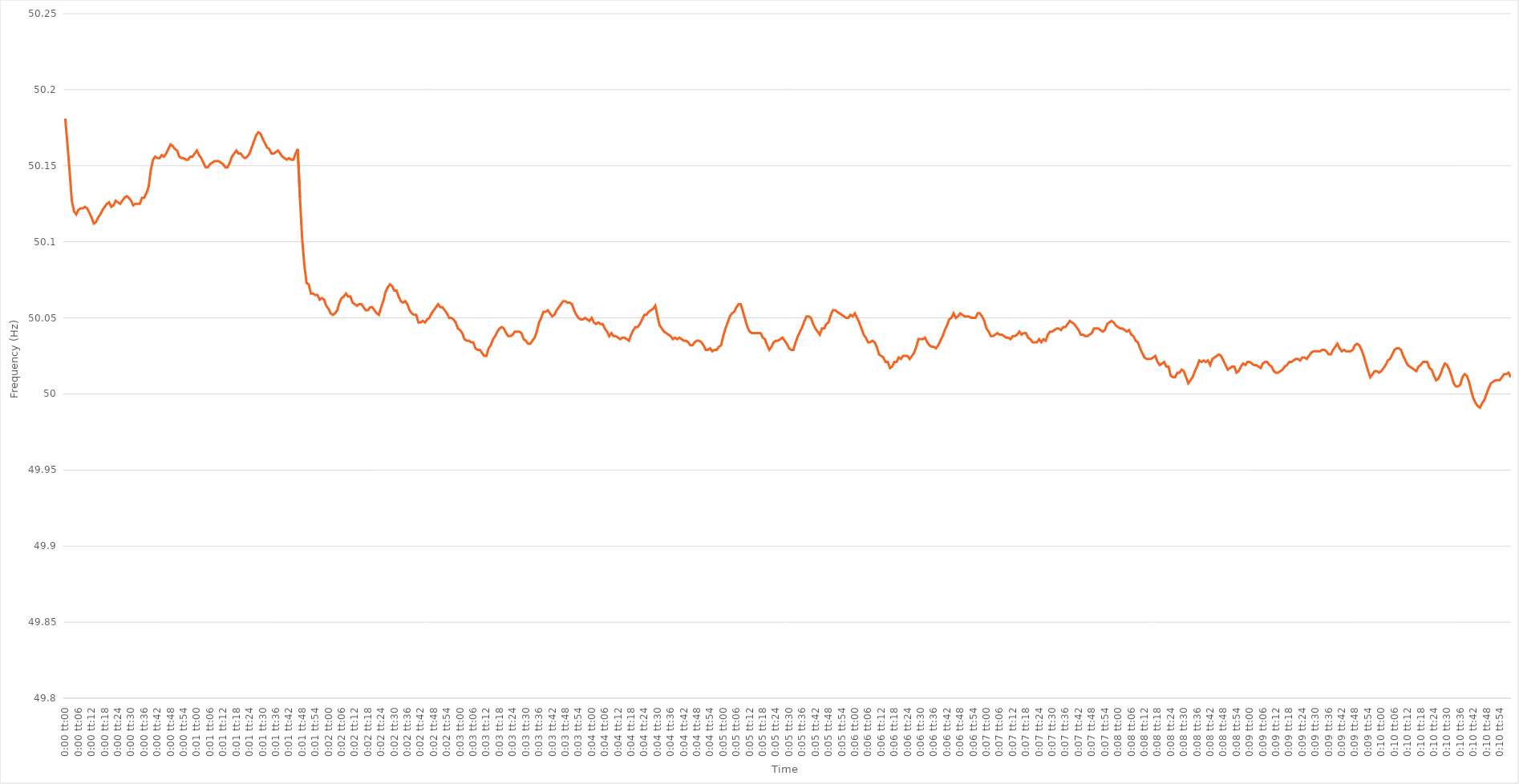
| Category | Series 0 |
|---|---|
| 0.0 | 50.181 |
| 1.1574074074074073e-05 | 50.164 |
| 2.3148148148148147e-05 | 50.146 |
| 3.472222222222222e-05 | 50.127 |
| 4.6296296296296294e-05 | 50.12 |
| 5.7870370370370366e-05 | 50.118 |
| 6.944444444444444e-05 | 50.121 |
| 8.101851851851852e-05 | 50.122 |
| 9.259259259259259e-05 | 50.122 |
| 0.00010416666666666667 | 50.123 |
| 0.00011574074074074073 | 50.122 |
| 0.0001273148148148148 | 50.119 |
| 0.0001388888888888889 | 50.116 |
| 0.00015046296296296297 | 50.112 |
| 0.00016203703703703703 | 50.113 |
| 0.00017361111111111112 | 50.116 |
| 0.00018518518518518518 | 50.118 |
| 0.00019675925925925926 | 50.121 |
| 0.00020833333333333335 | 50.123 |
| 0.0002199074074074074 | 50.125 |
| 0.00023148148148148146 | 50.126 |
| 0.00024305555555555552 | 50.123 |
| 0.0002546296296296296 | 50.124 |
| 0.0002662037037037037 | 50.127 |
| 0.0002777777777777778 | 50.126 |
| 0.0002893518518518519 | 50.125 |
| 0.00030092592592592595 | 50.127 |
| 0.0003125 | 50.129 |
| 0.00032407407407407406 | 50.13 |
| 0.0003356481481481481 | 50.129 |
| 0.00034722222222222224 | 50.127 |
| 0.00035879629629629635 | 50.124 |
| 0.00037037037037037035 | 50.125 |
| 0.00038194444444444446 | 50.125 |
| 0.0003935185185185185 | 50.125 |
| 0.0004050925925925926 | 50.129 |
| 0.0004166666666666667 | 50.129 |
| 0.00042824074074074075 | 50.132 |
| 0.0004398148148148148 | 50.136 |
| 0.0004513888888888889 | 50.147 |
| 0.0004629629629629629 | 50.154 |
| 0.00047453703703703704 | 50.156 |
| 0.00048611111111111104 | 50.155 |
| 0.0004976851851851852 | 50.155 |
| 0.0005092592592592592 | 50.157 |
| 0.0005208333333333333 | 50.156 |
| 0.0005324074074074074 | 50.158 |
| 0.0005439814814814814 | 50.161 |
| 0.0005555555555555556 | 50.164 |
| 0.0005671296296296296 | 50.163 |
| 0.0005787037037037038 | 50.161 |
| 0.0005902777777777778 | 50.16 |
| 0.0006018518518518519 | 50.156 |
| 0.0006134259259259259 | 50.155 |
| 0.000625 | 50.155 |
| 0.000636574074074074 | 50.154 |
| 0.0006481481481481481 | 50.154 |
| 0.0006597222222222221 | 50.156 |
| 0.0006712962962962962 | 50.156 |
| 0.0006828703703703703 | 50.158 |
| 0.0006944444444444445 | 50.16 |
| 0.0007060185185185185 | 50.157 |
| 0.0007175925925925927 | 50.155 |
| 0.0007291666666666667 | 50.152 |
| 0.0007407407407407407 | 50.149 |
| 0.0007523148148148147 | 50.149 |
| 0.0007638888888888889 | 50.151 |
| 0.000775462962962963 | 50.152 |
| 0.000787037037037037 | 50.153 |
| 0.000798611111111111 | 50.153 |
| 0.0008101851851851852 | 50.153 |
| 0.0008217592592592592 | 50.152 |
| 0.0008333333333333334 | 50.151 |
| 0.0008449074074074075 | 50.149 |
| 0.0008564814814814815 | 50.149 |
| 0.0008680555555555555 | 50.152 |
| 0.0008796296296296296 | 50.156 |
| 0.0008912037037037036 | 50.158 |
| 0.0009027777777777778 | 50.16 |
| 0.0009143518518518518 | 50.158 |
| 0.0009259259259259259 | 50.158 |
| 0.0009375000000000001 | 50.156 |
| 0.0009490740740740741 | 50.155 |
| 0.0009606481481481481 | 50.156 |
| 0.0009722222222222221 | 50.158 |
| 0.0009837962962962964 | 50.162 |
| 0.0009953703703703704 | 50.166 |
| 0.0010069444444444444 | 50.17 |
| 0.0010185185185185186 | 50.172 |
| 0.0010300925925925926 | 50.171 |
| 0.0010416666666666667 | 50.168 |
| 0.0010532407407407407 | 50.165 |
| 0.0010648148148148147 | 50.162 |
| 0.0010763888888888889 | 50.161 |
| 0.0010879629629629629 | 50.158 |
| 0.001099537037037037 | 50.158 |
| 0.0011111111111111111 | 50.159 |
| 0.0011226851851851851 | 50.16 |
| 0.0011342592592592591 | 50.158 |
| 0.0011458333333333333 | 50.156 |
| 0.0011574074074074073 | 50.155 |
| 0.0011689814814814816 | 50.154 |
| 0.0011805555555555556 | 50.155 |
| 0.0011921296296296296 | 50.154 |
| 0.0012037037037037038 | 50.154 |
| 0.0012152777777777778 | 50.158 |
| 0.0012268518518518518 | 50.161 |
| 0.0012384259259259258 | 50.129 |
| 0.00125 | 50.102 |
| 0.001261574074074074 | 50.085 |
| 0.0012731481481481483 | 50.073 |
| 0.0012847222222222223 | 50.072 |
| 0.0012962962962962963 | 50.066 |
| 0.0013078703703703705 | 50.066 |
| 0.0013194444444444443 | 50.065 |
| 0.0013310185185185185 | 50.065 |
| 0.0013425925925925925 | 50.062 |
| 0.0013541666666666667 | 50.063 |
| 0.001365740740740741 | 50.062 |
| 0.0013773148148148147 | 50.058 |
| 0.001388888888888889 | 50.056 |
| 0.001400462962962963 | 50.053 |
| 0.001412037037037037 | 50.052 |
| 0.001423611111111111 | 50.053 |
| 0.0014351851851851854 | 50.055 |
| 0.0014467592592592594 | 50.06 |
| 0.0014583333333333334 | 50.063 |
| 0.0014699074074074074 | 50.064 |
| 0.0014814814814814814 | 50.066 |
| 0.0014930555555555556 | 50.064 |
| 0.0015046296296296294 | 50.064 |
| 0.0015162037037037036 | 50.06 |
| 0.0015277777777777779 | 50.059 |
| 0.0015393518518518519 | 50.058 |
| 0.001550925925925926 | 50.059 |
| 0.0015624999999999999 | 50.059 |
| 0.001574074074074074 | 50.057 |
| 0.0015856481481481479 | 50.055 |
| 0.001597222222222222 | 50.055 |
| 0.0016087962962962963 | 50.057 |
| 0.0016203703703703703 | 50.057 |
| 0.0016319444444444445 | 50.055 |
| 0.0016435185185185183 | 50.053 |
| 0.0016550925925925926 | 50.052 |
| 0.0016666666666666668 | 50.057 |
| 0.0016782407407407406 | 50.061 |
| 0.001689814814814815 | 50.067 |
| 0.0017013888888888892 | 50.07 |
| 0.001712962962962963 | 50.072 |
| 0.0017245370370370372 | 50.071 |
| 0.001736111111111111 | 50.068 |
| 0.0017476851851851852 | 50.068 |
| 0.0017592592592592592 | 50.064 |
| 0.0017708333333333332 | 50.061 |
| 0.0017824074074074072 | 50.06 |
| 0.0017939814814814815 | 50.061 |
| 0.0018055555555555557 | 50.059 |
| 0.0018171296296296297 | 50.055 |
| 0.0018287037037037037 | 50.053 |
| 0.0018402777777777777 | 50.052 |
| 0.0018518518518518517 | 50.052 |
| 0.0018634259259259261 | 50.047 |
| 0.0018750000000000001 | 50.047 |
| 0.0018865740740740742 | 50.048 |
| 0.0018981481481481482 | 50.047 |
| 0.0019097222222222222 | 50.049 |
| 0.0019212962962962962 | 50.05 |
| 0.0019328703703703704 | 50.053 |
| 0.0019444444444444442 | 50.055 |
| 0.0019560185185185184 | 50.057 |
| 0.001967592592592593 | 50.059 |
| 0.001979166666666667 | 50.057 |
| 0.001990740740740741 | 50.057 |
| 0.002002314814814815 | 50.055 |
| 0.002013888888888889 | 50.053 |
| 0.002025462962962963 | 50.05 |
| 0.0020370370370370373 | 50.05 |
| 0.0020486111111111113 | 50.049 |
| 0.0020601851851851853 | 50.047 |
| 0.0020717592592592593 | 50.043 |
| 0.0020833333333333333 | 50.042 |
| 0.0020949074074074073 | 50.04 |
| 0.0021064814814814813 | 50.036 |
| 0.0021180555555555553 | 50.035 |
| 0.0021296296296296298 | 50.035 |
| 0.0021412037037037038 | 50.034 |
| 0.0021527777777777778 | 50.034 |
| 0.0021643518518518518 | 50.03 |
| 0.0021759259259259258 | 50.029 |
| 0.0021874999999999998 | 50.029 |
| 0.002199074074074074 | 50.027 |
| 0.0022106481481481478 | 50.025 |
| 0.0022222222222222222 | 50.025 |
| 0.0022337962962962967 | 50.03 |
| 0.0022453703703703702 | 50.032 |
| 0.0022569444444444447 | 50.036 |
| 0.0022685185185185182 | 50.038 |
| 0.0022800925925925927 | 50.041 |
| 0.0022916666666666667 | 50.043 |
| 0.0023032407407407407 | 50.044 |
| 0.002314814814814815 | 50.043 |
| 0.0023263888888888887 | 50.04 |
| 0.002337962962962963 | 50.038 |
| 0.002349537037037037 | 50.038 |
| 0.002361111111111111 | 50.039 |
| 0.002372685185185185 | 50.041 |
| 0.002384259259259259 | 50.041 |
| 0.0023958333333333336 | 50.041 |
| 0.0024074074074074076 | 50.04 |
| 0.0024189814814814816 | 50.036 |
| 0.0024305555555555556 | 50.035 |
| 0.0024421296296296296 | 50.033 |
| 0.0024537037037037036 | 50.033 |
| 0.0024652777777777776 | 50.035 |
| 0.0024768518518518516 | 50.037 |
| 0.002488425925925926 | 50.041 |
| 0.0025 | 50.047 |
| 0.002511574074074074 | 50.05 |
| 0.002523148148148148 | 50.054 |
| 0.002534722222222222 | 50.054 |
| 0.002546296296296296 | 50.055 |
| 0.0025578703703703705 | 50.053 |
| 0.0025694444444444445 | 50.051 |
| 0.0025810185185185185 | 50.052 |
| 0.0025925925925925925 | 50.055 |
| 0.0026041666666666665 | 50.057 |
| 0.002615740740740741 | 50.059 |
| 0.002627314814814815 | 50.061 |
| 0.0026388888888888885 | 50.061 |
| 0.0026504629629629625 | 50.06 |
| 0.0026620370370370374 | 50.06 |
| 0.002673611111111111 | 50.059 |
| 0.002685185185185185 | 50.055 |
| 0.0026967592592592594 | 50.052 |
| 0.0027083333333333334 | 50.05 |
| 0.0027199074074074074 | 50.049 |
| 0.002731481481481482 | 50.049 |
| 0.002743055555555556 | 50.05 |
| 0.0027546296296296294 | 50.049 |
| 0.0027662037037037034 | 50.048 |
| 0.002777777777777778 | 50.05 |
| 0.002789351851851852 | 50.047 |
| 0.002800925925925926 | 50.046 |
| 0.0028124999999999995 | 50.047 |
| 0.002824074074074074 | 50.046 |
| 0.002835648148148148 | 50.046 |
| 0.002847222222222222 | 50.043 |
| 0.0028587962962962963 | 50.041 |
| 0.002870370370370371 | 50.038 |
| 0.0028819444444444444 | 50.04 |
| 0.002893518518518519 | 50.038 |
| 0.002905092592592593 | 50.038 |
| 0.002916666666666667 | 50.037 |
| 0.0029282407407407412 | 50.036 |
| 0.002939814814814815 | 50.037 |
| 0.002951388888888889 | 50.037 |
| 0.002962962962962963 | 50.036 |
| 0.0029745370370370373 | 50.035 |
| 0.0029861111111111113 | 50.039 |
| 0.002997685185185185 | 50.042 |
| 0.003009259259259259 | 50.044 |
| 0.0030208333333333333 | 50.044 |
| 0.0030324074074074073 | 50.046 |
| 0.003043981481481482 | 50.049 |
| 0.0030555555555555557 | 50.052 |
| 0.0030671296296296297 | 50.052 |
| 0.0030787037037037037 | 50.054 |
| 0.003090277777777778 | 50.055 |
| 0.003101851851851852 | 50.056 |
| 0.0031134259259259257 | 50.058 |
| 0.0031249999999999997 | 50.051 |
| 0.003136574074074074 | 50.045 |
| 0.003148148148148148 | 50.043 |
| 0.003159722222222222 | 50.041 |
| 0.0031712962962962958 | 50.04 |
| 0.00318287037037037 | 50.039 |
| 0.003194444444444444 | 50.038 |
| 0.003206018518518519 | 50.036 |
| 0.0032175925925925926 | 50.037 |
| 0.0032291666666666666 | 50.036 |
| 0.0032407407407407406 | 50.037 |
| 0.003252314814814815 | 50.036 |
| 0.003263888888888889 | 50.035 |
| 0.003275462962962963 | 50.035 |
| 0.0032870370370370367 | 50.034 |
| 0.003298611111111111 | 50.032 |
| 0.003310185185185185 | 50.032 |
| 0.003321759259259259 | 50.034 |
| 0.0033333333333333335 | 50.035 |
| 0.003344907407407407 | 50.035 |
| 0.003356481481481481 | 50.034 |
| 0.003368055555555555 | 50.032 |
| 0.00337962962962963 | 50.029 |
| 0.0033912037037037036 | 50.029 |
| 0.0034027777777777784 | 50.03 |
| 0.003414351851851852 | 50.028 |
| 0.003425925925925926 | 50.029 |
| 0.0034375 | 50.029 |
| 0.0034490740740740745 | 50.031 |
| 0.0034606481481481485 | 50.032 |
| 0.003472222222222222 | 50.038 |
| 0.003483796296296296 | 50.043 |
| 0.0034953703703703705 | 50.047 |
| 0.0035069444444444445 | 50.051 |
| 0.0035185185185185185 | 50.053 |
| 0.003530092592592592 | 50.054 |
| 0.0035416666666666665 | 50.057 |
| 0.0035532407407407405 | 50.059 |
| 0.0035648148148148154 | 50.059 |
| 0.0035763888888888894 | 50.054 |
| 0.003587962962962963 | 50.049 |
| 0.003599537037037037 | 50.044 |
| 0.0036111111111111114 | 50.041 |
| 0.0036226851851851854 | 50.04 |
| 0.0036342592592592594 | 50.04 |
| 0.003645833333333333 | 50.04 |
| 0.0036574074074074074 | 50.04 |
| 0.0036689814814814814 | 50.04 |
| 0.0036805555555555554 | 50.037 |
| 0.00369212962962963 | 50.036 |
| 0.0037037037037037034 | 50.032 |
| 0.0037152777777777774 | 50.029 |
| 0.0037268518518518514 | 50.031 |
| 0.0037384259259259263 | 50.034 |
| 0.0037500000000000003 | 50.035 |
| 0.003761574074074074 | 50.035 |
| 0.0037731481481481483 | 50.036 |
| 0.0037847222222222223 | 50.037 |
| 0.0037962962962962963 | 50.035 |
| 0.0038078703703703707 | 50.033 |
| 0.0038194444444444443 | 50.03 |
| 0.0038310185185185183 | 50.029 |
| 0.0038425925925925923 | 50.029 |
| 0.0038541666666666668 | 50.034 |
| 0.0038657407407407408 | 50.038 |
| 0.0038773148148148143 | 50.041 |
| 0.0038888888888888883 | 50.044 |
| 0.003900462962962963 | 50.048 |
| 0.003912037037037037 | 50.051 |
| 0.003923611111111111 | 50.051 |
| 0.003935185185185186 | 50.05 |
| 0.003946759259259259 | 50.046 |
| 0.003958333333333334 | 50.043 |
| 0.003969907407407407 | 50.041 |
| 0.003981481481481482 | 50.039 |
| 0.003993055555555556 | 50.043 |
| 0.00400462962962963 | 50.043 |
| 0.004016203703703703 | 50.046 |
| 0.004027777777777778 | 50.047 |
| 0.004039351851851852 | 50.052 |
| 0.004050925925925926 | 50.055 |
| 0.004062499999999999 | 50.055 |
| 0.004074074074074075 | 50.054 |
| 0.004085648148148148 | 50.053 |
| 0.004097222222222223 | 50.052 |
| 0.004108796296296297 | 50.051 |
| 0.004120370370370371 | 50.05 |
| 0.004131944444444444 | 50.05 |
| 0.004143518518518519 | 50.052 |
| 0.004155092592592593 | 50.051 |
| 0.004166666666666667 | 50.053 |
| 0.00417824074074074 | 50.05 |
| 0.004189814814814815 | 50.047 |
| 0.004201388888888889 | 50.043 |
| 0.004212962962962963 | 50.039 |
| 0.004224537037037037 | 50.037 |
| 0.004236111111111111 | 50.034 |
| 0.004247685185185185 | 50.034 |
| 0.0042592592592592595 | 50.035 |
| 0.004270833333333334 | 50.034 |
| 0.0042824074074074075 | 50.031 |
| 0.004293981481481481 | 50.026 |
| 0.0043055555555555555 | 50.025 |
| 0.00431712962962963 | 50.024 |
| 0.0043287037037037035 | 50.021 |
| 0.004340277777777778 | 50.021 |
| 0.0043518518518518515 | 50.017 |
| 0.004363425925925926 | 50.018 |
| 0.0043749999999999995 | 50.021 |
| 0.004386574074074074 | 50.021 |
| 0.004398148148148148 | 50.024 |
| 0.004409722222222222 | 50.023 |
| 0.0044212962962962956 | 50.025 |
| 0.004432870370370371 | 50.025 |
| 0.0044444444444444444 | 50.025 |
| 0.004456018518518519 | 50.023 |
| 0.004467592592592593 | 50.025 |
| 0.004479166666666667 | 50.027 |
| 0.0044907407407407405 | 50.031 |
| 0.004502314814814815 | 50.036 |
| 0.004513888888888889 | 50.036 |
| 0.004525462962962963 | 50.036 |
| 0.0045370370370370365 | 50.037 |
| 0.004548611111111111 | 50.034 |
| 0.004560185185185185 | 50.032 |
| 0.004571759259259259 | 50.031 |
| 0.004583333333333333 | 50.031 |
| 0.004594907407407408 | 50.03 |
| 0.004606481481481481 | 50.032 |
| 0.004618055555555556 | 50.035 |
| 0.00462962962962963 | 50.038 |
| 0.004641203703703704 | 50.042 |
| 0.004652777777777777 | 50.045 |
| 0.004664351851851852 | 50.049 |
| 0.004675925925925926 | 50.05 |
| 0.0046875 | 50.053 |
| 0.004699074074074074 | 50.05 |
| 0.004710648148148148 | 50.051 |
| 0.004722222222222222 | 50.053 |
| 0.004733796296296296 | 50.052 |
| 0.00474537037037037 | 50.051 |
| 0.004756944444444445 | 50.051 |
| 0.004768518518518518 | 50.051 |
| 0.004780092592592592 | 50.05 |
| 0.004791666666666667 | 50.05 |
| 0.004803240740740741 | 50.05 |
| 0.004814814814814815 | 50.053 |
| 0.004826388888888889 | 50.053 |
| 0.004837962962962963 | 50.051 |
| 0.004849537037037037 | 50.048 |
| 0.004861111111111111 | 50.043 |
| 0.004872685185185186 | 50.041 |
| 0.004884259259259259 | 50.038 |
| 0.004895833333333333 | 50.038 |
| 0.004907407407407407 | 50.039 |
| 0.004918981481481482 | 50.04 |
| 0.004930555555555555 | 50.039 |
| 0.004942129629629629 | 50.039 |
| 0.004953703703703704 | 50.038 |
| 0.004965277777777778 | 50.037 |
| 0.004976851851851852 | 50.037 |
| 0.0049884259259259265 | 50.036 |
| 0.005 | 50.038 |
| 0.005011574074074074 | 50.038 |
| 0.005023148148148148 | 50.039 |
| 0.0050347222222222225 | 50.041 |
| 0.005046296296296296 | 50.039 |
| 0.0050578703703703706 | 50.04 |
| 0.005069444444444444 | 50.04 |
| 0.0050810185185185186 | 50.037 |
| 0.005092592592592592 | 50.036 |
| 0.005104166666666667 | 50.034 |
| 0.005115740740740741 | 50.034 |
| 0.005127314814814815 | 50.034 |
| 0.005138888888888889 | 50.036 |
| 0.0051504629629629635 | 50.034 |
| 0.005162037037037037 | 50.036 |
| 0.0051736111111111115 | 50.035 |
| 0.005185185185185185 | 50.039 |
| 0.0051967592592592595 | 50.041 |
| 0.005208333333333333 | 50.041 |
| 0.005219907407407407 | 50.042 |
| 0.005231481481481482 | 50.043 |
| 0.0052430555555555555 | 50.043 |
| 0.00525462962962963 | 50.042 |
| 0.0052662037037037035 | 50.044 |
| 0.005277777777777777 | 50.044 |
| 0.0052893518518518515 | 50.046 |
| 0.005300925925925925 | 50.048 |
| 0.0053125 | 50.047 |
| 0.005324074074074075 | 50.046 |
| 0.005335648148148148 | 50.044 |
| 0.005347222222222222 | 50.042 |
| 0.005358796296296296 | 50.039 |
| 0.00537037037037037 | 50.039 |
| 0.005381944444444445 | 50.038 |
| 0.005393518518518519 | 50.038 |
| 0.005405092592592592 | 50.039 |
| 0.005416666666666667 | 50.04 |
| 0.00542824074074074 | 50.043 |
| 0.005439814814814815 | 50.043 |
| 0.005451388888888888 | 50.043 |
| 0.005462962962962964 | 50.042 |
| 0.005474537037037037 | 50.041 |
| 0.005486111111111112 | 50.042 |
| 0.005497685185185185 | 50.046 |
| 0.005509259259259259 | 50.047 |
| 0.005520833333333333 | 50.048 |
| 0.005532407407407407 | 50.047 |
| 0.005543981481481482 | 50.045 |
| 0.005555555555555556 | 50.044 |
| 0.00556712962962963 | 50.043 |
| 0.005578703703703704 | 50.043 |
| 0.005590277777777778 | 50.042 |
| 0.005601851851851852 | 50.041 |
| 0.005613425925925927 | 50.042 |
| 0.005624999999999999 | 50.039 |
| 0.005636574074074074 | 50.038 |
| 0.005648148148148148 | 50.035 |
| 0.005659722222222222 | 50.034 |
| 0.005671296296296296 | 50.03 |
| 0.00568287037037037 | 50.027 |
| 0.005694444444444444 | 50.024 |
| 0.005706018518518519 | 50.023 |
| 0.005717592592592593 | 50.023 |
| 0.005729166666666667 | 50.023 |
| 0.005740740740740742 | 50.024 |
| 0.005752314814814814 | 50.025 |
| 0.005763888888888889 | 50.021 |
| 0.005775462962962962 | 50.019 |
| 0.005787037037037038 | 50.02 |
| 0.005798611111111111 | 50.021 |
| 0.005810185185185186 | 50.018 |
| 0.005821759259259259 | 50.018 |
| 0.005833333333333334 | 50.012 |
| 0.005844907407407407 | 50.011 |
| 0.0058564814814814825 | 50.011 |
| 0.005868055555555554 | 50.014 |
| 0.00587962962962963 | 50.014 |
| 0.005891203703703703 | 50.016 |
| 0.005902777777777778 | 50.015 |
| 0.005914351851851852 | 50.011 |
| 0.005925925925925926 | 50.007 |
| 0.005937500000000001 | 50.009 |
| 0.0059490740740740745 | 50.011 |
| 0.005960648148148149 | 50.015 |
| 0.0059722222222222225 | 50.018 |
| 0.005983796296296296 | 50.022 |
| 0.00599537037037037 | 50.021 |
| 0.006006944444444444 | 50.022 |
| 0.006018518518518518 | 50.021 |
| 0.006030092592592593 | 50.022 |
| 0.0060416666666666665 | 50.019 |
| 0.006053240740740741 | 50.023 |
| 0.0060648148148148145 | 50.024 |
| 0.006076388888888889 | 50.025 |
| 0.006087962962962964 | 50.026 |
| 0.006099537037037036 | 50.025 |
| 0.006111111111111111 | 50.022 |
| 0.006122685185185185 | 50.019 |
| 0.0061342592592592594 | 50.016 |
| 0.006145833333333333 | 50.017 |
| 0.0061574074074074074 | 50.018 |
| 0.006168981481481481 | 50.018 |
| 0.006180555555555556 | 50.014 |
| 0.00619212962962963 | 50.015 |
| 0.006203703703703704 | 50.018 |
| 0.006215277777777777 | 50.02 |
| 0.0062268518518518515 | 50.019 |
| 0.006238425925925925 | 50.021 |
| 0.0062499999999999995 | 50.021 |
| 0.006261574074074075 | 50.02 |
| 0.006273148148148148 | 50.019 |
| 0.006284722222222223 | 50.019 |
| 0.006296296296296296 | 50.018 |
| 0.006307870370370371 | 50.017 |
| 0.006319444444444444 | 50.02 |
| 0.00633101851851852 | 50.021 |
| 0.0063425925925925915 | 50.021 |
| 0.006354166666666667 | 50.019 |
| 0.00636574074074074 | 50.018 |
| 0.006377314814814815 | 50.015 |
| 0.006388888888888888 | 50.014 |
| 0.006400462962962963 | 50.014 |
| 0.006412037037037036 | 50.015 |
| 0.006423611111111112 | 50.016 |
| 0.006435185185185186 | 50.018 |
| 0.00644675925925926 | 50.019 |
| 0.006458333333333333 | 50.021 |
| 0.006469907407407407 | 50.021 |
| 0.006481481481481481 | 50.022 |
| 0.006493055555555555 | 50.023 |
| 0.00650462962962963 | 50.023 |
| 0.006516203703703704 | 50.022 |
| 0.006527777777777778 | 50.024 |
| 0.006539351851851852 | 50.024 |
| 0.006550925925925926 | 50.023 |
| 0.0065625 | 50.025 |
| 0.006574074074074073 | 50.027 |
| 0.006585648148148147 | 50.028 |
| 0.006597222222222222 | 50.028 |
| 0.006608796296296297 | 50.028 |
| 0.00662037037037037 | 50.028 |
| 0.006631944444444445 | 50.029 |
| 0.006643518518518518 | 50.029 |
| 0.0066550925925925935 | 50.028 |
| 0.006666666666666667 | 50.026 |
| 0.0066782407407407415 | 50.026 |
| 0.006689814814814814 | 50.029 |
| 0.006701388888888889 | 50.031 |
| 0.006712962962962962 | 50.033 |
| 0.006724537037037037 | 50.03 |
| 0.00673611111111111 | 50.028 |
| 0.0067476851851851856 | 50.029 |
| 0.006759259259259259 | 50.028 |
| 0.0067708333333333336 | 50.028 |
| 0.006782407407407408 | 50.028 |
| 0.006793981481481482 | 50.029 |
| 0.006805555555555557 | 50.032 |
| 0.006817129629629629 | 50.033 |
| 0.006828703703703704 | 50.032 |
| 0.006840277777777778 | 50.029 |
| 0.006851851851851852 | 50.025 |
| 0.006863425925925926 | 50.02 |
| 0.006875 | 50.015 |
| 0.006886574074074074 | 50.011 |
| 0.006898148148148149 | 50.013 |
| 0.0069097222222222225 | 50.015 |
| 0.006921296296296297 | 50.015 |
| 0.00693287037037037 | 50.014 |
| 0.006944444444444444 | 50.015 |
| 0.0069560185185185185 | 50.017 |
| 0.006967592592592592 | 50.019 |
| 0.006979166666666667 | 50.022 |
| 0.006990740740740741 | 50.023 |
| 0.007002314814814815 | 50.026 |
| 0.007013888888888889 | 50.029 |
| 0.007025462962962963 | 50.03 |
| 0.007037037037037037 | 50.03 |
| 0.0070486111111111105 | 50.029 |
| 0.007060185185185184 | 50.025 |
| 0.007071759259259259 | 50.022 |
| 0.007083333333333333 | 50.019 |
| 0.007094907407407407 | 50.018 |
| 0.007106481481481481 | 50.017 |
| 0.007118055555555555 | 50.016 |
| 0.007129629629629631 | 50.015 |
| 0.007141203703703704 | 50.018 |
| 0.007152777777777779 | 50.019 |
| 0.0071643518518518514 | 50.021 |
| 0.007175925925925926 | 50.021 |
| 0.0071874999999999994 | 50.021 |
| 0.007199074074074074 | 50.017 |
| 0.0072106481481481475 | 50.016 |
| 0.007222222222222223 | 50.012 |
| 0.007233796296296296 | 50.009 |
| 0.007245370370370371 | 50.01 |
| 0.007256944444444444 | 50.013 |
| 0.007268518518518519 | 50.017 |
| 0.0072800925925925915 | 50.02 |
| 0.007291666666666666 | 50.019 |
| 0.007303240740740741 | 50.016 |
| 0.007314814814814815 | 50.012 |
| 0.007326388888888889 | 50.007 |
| 0.007337962962962963 | 50.005 |
| 0.007349537037037037 | 50.005 |
| 0.007361111111111111 | 50.006 |
| 0.007372685185185186 | 50.011 |
| 0.00738425925925926 | 50.013 |
| 0.007395833333333334 | 50.012 |
| 0.007407407407407407 | 50.008 |
| 0.007418981481481481 | 50.002 |
| 0.007430555555555555 | 49.997 |
| 0.007442129629629629 | 49.994 |
| 0.007453703703703703 | 49.992 |
| 0.007465277777777778 | 49.991 |
| 0.007476851851851853 | 49.994 |
| 0.007488425925925926 | 49.996 |
| 0.007500000000000001 | 50 |
| 0.007511574074074074 | 50.004 |
| 0.007523148148148148 | 50.007 |
| 0.007534722222222221 | 50.008 |
| 0.007546296296296297 | 50.009 |
| 0.00755787037037037 | 50.009 |
| 0.007569444444444445 | 50.009 |
| 0.007581018518518518 | 50.011 |
| 0.007592592592592593 | 50.013 |
| 0.007604166666666666 | 50.013 |
| 0.0076157407407407415 | 50.014 |
| 0.007627314814814815 | 50.011 |